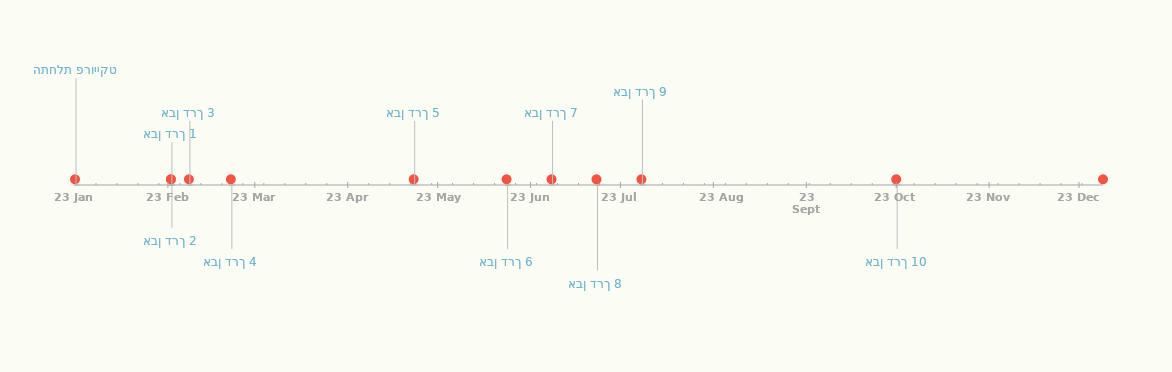
| Category | תפקיד |
|---|---|
| התחלת פרוייקט | 25 |
| אבן דרך 1 | 10 |
| אבן דרך 2 | -10 |
| אבן דרך 3 | 15 |
| אבן דרך 4 | -15 |
| אבן דרך 5 | 15 |
| אבן דרך 6 | -15 |
| אבן דרך 7 | 15 |
| אבן דרך 8 | -20 |
| אבן דרך 9 | 20 |
| אבן דרך 10 | -15 |
| סיום פרוייקט | 15 |